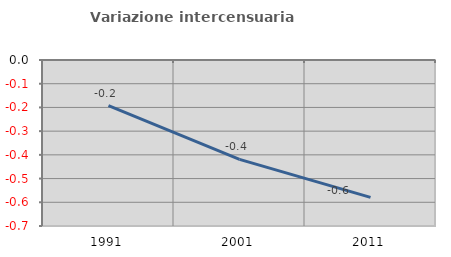
| Category | Variazione intercensuaria annua |
|---|---|
| 1991.0 | -0.193 |
| 2001.0 | -0.419 |
| 2011.0 | -0.579 |